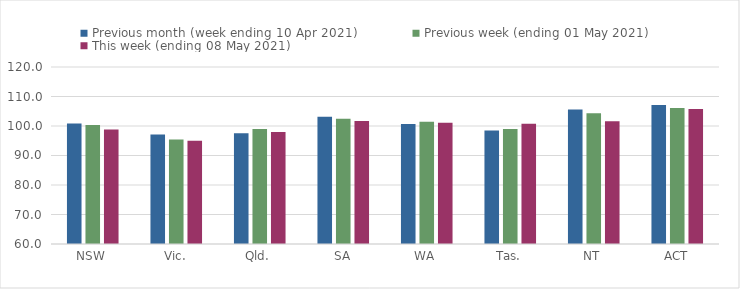
| Category | Previous month (week ending 10 Apr 2021) | Previous week (ending 01 May 2021) | This week (ending 08 May 2021) |
|---|---|---|---|
| NSW | 100.85 | 100.33 | 98.82 |
| Vic. | 97.1 | 95.43 | 95.01 |
| Qld. | 97.54 | 98.95 | 98 |
| SA | 103.11 | 102.45 | 101.71 |
| WA | 100.71 | 101.4 | 101.14 |
| Tas. | 98.45 | 99 | 100.76 |
| NT | 105.57 | 104.31 | 101.62 |
| ACT | 107.16 | 106.14 | 105.73 |